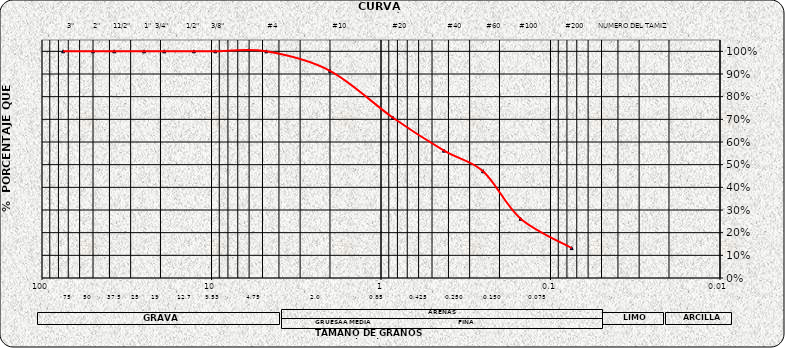
| Category | Series 0 |
|---|---|
| 75.0 | 1 |
| 50.0 | 1 |
| 37.5 | 1 |
| 25.0 | 1 |
| 19.0 | 1 |
| 12.7 | 1 |
| 9.5 | 1 |
| 4.75 | 1 |
| 2.0 | 0.914 |
| 0.85 | 0.707 |
| 0.425 | 0.562 |
| 0.25 | 0.471 |
| 0.15 | 0.261 |
| 0.075 | 0.132 |
| nan | 0 |